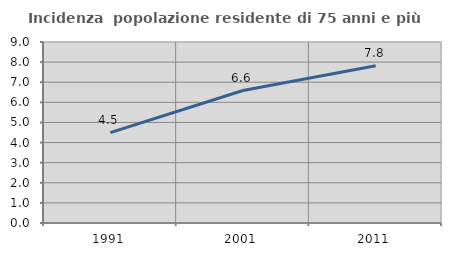
| Category | Incidenza  popolazione residente di 75 anni e più |
|---|---|
| 1991.0 | 4.491 |
| 2001.0 | 6.587 |
| 2011.0 | 7.816 |